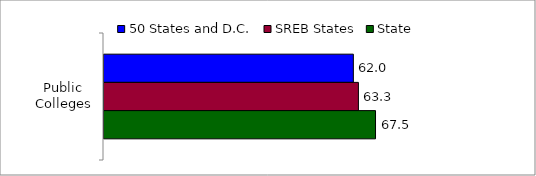
| Category | 50 States and D.C. | SREB States | State |
|---|---|---|---|
| Public Colleges | 62.029 | 63.287 | 67.544 |